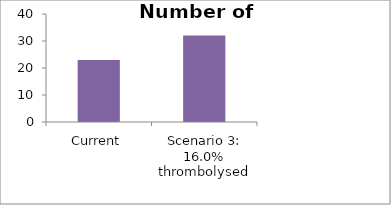
| Category | Number of patients thrombolysed |
|---|---|
| Current | 23 |
| Scenario 3: 16.0% thrombolysed | 32 |